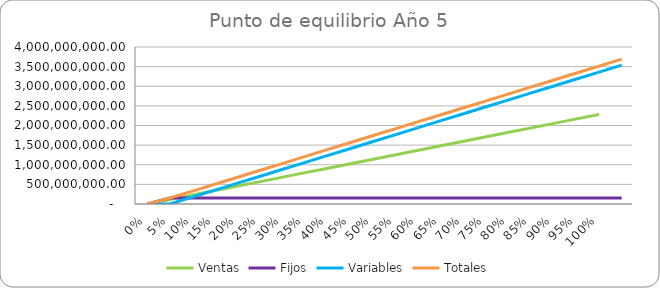
| Category | Ventas | Fijos | Variables | Totales |
|---|---|---|---|---|
| 0.0 | 0 | 0 | 0 | 0 |
| 0.05 | 114108750 | 152155371.942 | 0 | 152155371.942 |
| 0.1 | 228217500 | 152155371.942 | 176890469.781 | 329045841.723 |
| 0.15 | 342326250 | 152155371.942 | 353780939.562 | 505936311.504 |
| 0.2 | 456435000 | 152155371.942 | 530671409.343 | 682826781.285 |
| 0.25 | 570543750 | 152155371.942 | 707561879.125 | 859717251.066 |
| 0.3 | 684652500 | 152155371.942 | 884452348.906 | 1036607720.847 |
| 0.35 | 798761250 | 152155371.942 | 1061342818.687 | 1213498190.628 |
| 0.4 | 912870000 | 152155371.942 | 1238233288.468 | 1390388660.409 |
| 0.45 | 1026978750 | 152155371.942 | 1415123758.249 | 1567279130.191 |
| 0.5 | 1141087500 | 152155371.942 | 1592014228.03 | 1744169599.972 |
| 0.55 | 1255196250 | 152155371.942 | 1768904697.811 | 1921060069.753 |
| 0.6 | 1369305000 | 152155371.942 | 1945795167.592 | 2097950539.534 |
| 0.65 | 1483413750 | 152155371.942 | 2122685637.374 | 2274841009.315 |
| 0.7 | 1597522500 | 152155371.942 | 2299576107.155 | 2451731479.096 |
| 0.75 | 1711631250 | 152155371.942 | 2476466576.936 | 2628621948.877 |
| 0.8 | 1825740000 | 152155371.942 | 2653357046.717 | 2805512418.658 |
| 0.85 | 1939848750 | 152155371.942 | 2830247516.498 | 2982402888.44 |
| 0.9 | 2053957500 | 152155371.942 | 3007137986.279 | 3159293358.221 |
| 0.95 | 2168066250 | 152155371.942 | 3184028456.06 | 3336183828.002 |
| 1.0 | 2282175000 | 152155371.942 | 3360918925.841 | 3513074297.783 |